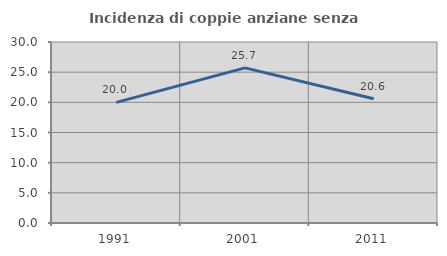
| Category | Incidenza di coppie anziane senza figli  |
|---|---|
| 1991.0 | 20 |
| 2001.0 | 25.714 |
| 2011.0 | 20.588 |